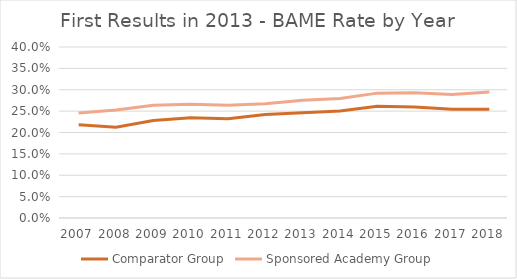
| Category | Comparator Group | Sponsored Academy Group |
|---|---|---|
| 2007.0 | 0.218 | 0.246 |
| 2008.0 | 0.212 | 0.252 |
| 2009.0 | 0.228 | 0.264 |
| 2010.0 | 0.234 | 0.266 |
| 2011.0 | 0.232 | 0.264 |
| 2012.0 | 0.242 | 0.267 |
| 2013.0 | 0.246 | 0.275 |
| 2014.0 | 0.25 | 0.28 |
| 2015.0 | 0.261 | 0.292 |
| 2016.0 | 0.26 | 0.293 |
| 2017.0 | 0.254 | 0.289 |
| 2018.0 | 0.255 | 0.295 |